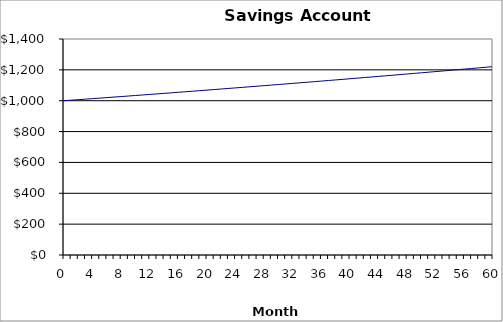
| Category | Series 0 |
|---|---|
| 0.0 | 1000 |
| 1.0 | 1003.33 |
| 2.0 | 1006.67 |
| 3.0 | 1010.03 |
| 4.0 | 1013.4 |
| 5.0 | 1016.78 |
| 6.0 | 1020.17 |
| 7.0 | 1023.57 |
| 8.0 | 1026.98 |
| 9.0 | 1030.4 |
| 10.0 | 1033.83 |
| 11.0 | 1037.28 |
| 12.0 | 1040.74 |
| 13.0 | 1044.21 |
| 14.0 | 1047.69 |
| 15.0 | 1051.18 |
| 16.0 | 1054.68 |
| 17.0 | 1058.2 |
| 18.0 | 1061.73 |
| 19.0 | 1065.27 |
| 20.0 | 1068.82 |
| 21.0 | 1072.38 |
| 22.0 | 1075.95 |
| 23.0 | 1079.54 |
| 24.0 | 1083.14 |
| 25.0 | 1086.75 |
| 26.0 | 1090.37 |
| 27.0 | 1094 |
| 28.0 | 1097.65 |
| 29.0 | 1101.31 |
| 30.0 | 1104.98 |
| 31.0 | 1108.66 |
| 32.0 | 1112.36 |
| 33.0 | 1116.07 |
| 34.0 | 1119.79 |
| 35.0 | 1123.52 |
| 36.0 | 1127.27 |
| 37.0 | 1131.03 |
| 38.0 | 1134.8 |
| 39.0 | 1138.58 |
| 40.0 | 1142.38 |
| 41.0 | 1146.19 |
| 42.0 | 1150.01 |
| 43.0 | 1153.84 |
| 44.0 | 1157.69 |
| 45.0 | 1161.55 |
| 46.0 | 1165.42 |
| 47.0 | 1169.3 |
| 48.0 | 1173.2 |
| 49.0 | 1177.11 |
| 50.0 | 1181.03 |
| 51.0 | 1184.97 |
| 52.0 | 1188.92 |
| 53.0 | 1192.88 |
| 54.0 | 1196.86 |
| 55.0 | 1200.85 |
| 56.0 | 1204.85 |
| 57.0 | 1208.87 |
| 58.0 | 1212.9 |
| 59.0 | 1216.94 |
| 60.0 | 1221 |